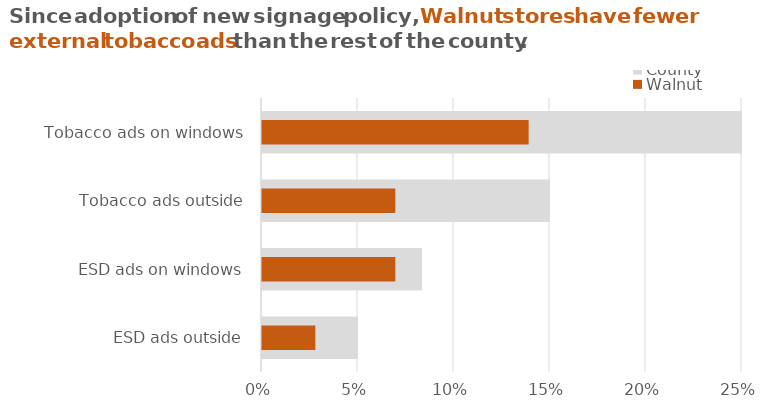
| Category | County |
|---|---|
| ESD ads outside | 0.05 |
| ESD ads on windows | 0.083 |
| Tobacco ads outside | 0.15 |
| Tobacco ads on windows | 0.25 |